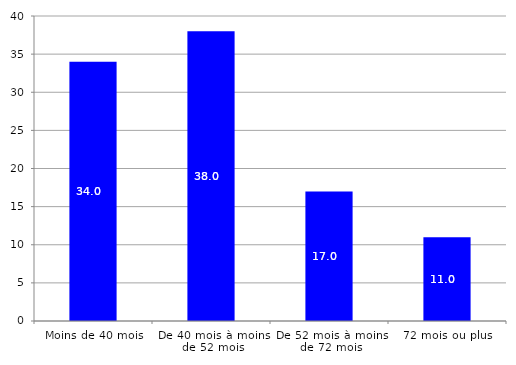
| Category | Series 0 |
|---|---|
| Moins de 40 mois | 34 |
| De 40 mois à moins de 52 mois | 38 |
| De 52 mois à moins de 72 mois | 17 |
| 72 mois ou plus | 11 |